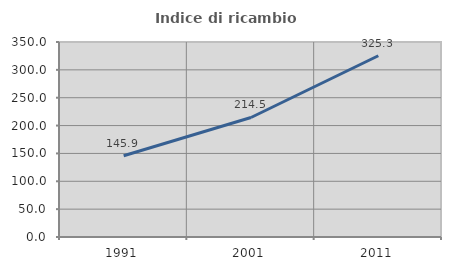
| Category | Indice di ricambio occupazionale  |
|---|---|
| 1991.0 | 145.892 |
| 2001.0 | 214.518 |
| 2011.0 | 325.333 |